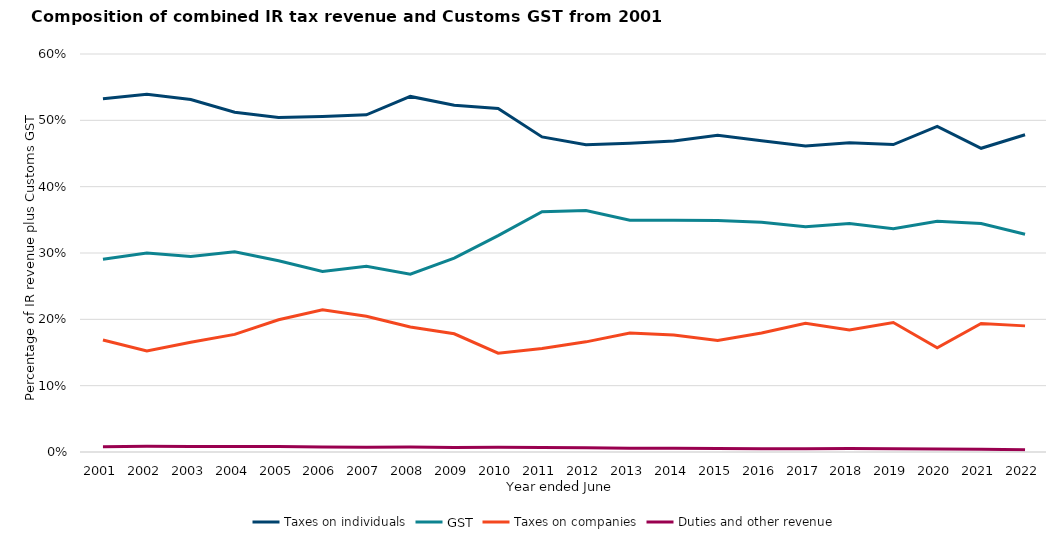
| Category | Taxes on individuals | GST | Taxes on companies | Duties and other revenue |
|---|---|---|---|---|
| 2001.0 | 0.533 | 0.291 | 0.169 | 0.008 |
| 2002.0 | 0.539 | 0.3 | 0.152 | 0.009 |
| 2003.0 | 0.531 | 0.295 | 0.165 | 0.008 |
| 2004.0 | 0.512 | 0.302 | 0.177 | 0.008 |
| 2005.0 | 0.504 | 0.288 | 0.199 | 0.008 |
| 2006.0 | 0.506 | 0.272 | 0.214 | 0.008 |
| 2007.0 | 0.508 | 0.28 | 0.205 | 0.007 |
| 2008.0 | 0.536 | 0.268 | 0.188 | 0.007 |
| 2009.0 | 0.523 | 0.292 | 0.178 | 0.007 |
| 2010.0 | 0.518 | 0.326 | 0.149 | 0.007 |
| 2011.0 | 0.475 | 0.362 | 0.156 | 0.007 |
| 2012.0 | 0.463 | 0.364 | 0.166 | 0.006 |
| 2013.0 | 0.465 | 0.349 | 0.179 | 0.006 |
| 2014.0 | 0.469 | 0.349 | 0.176 | 0.006 |
| 2015.0 | 0.477 | 0.349 | 0.168 | 0.005 |
| 2016.0 | 0.469 | 0.347 | 0.179 | 0.005 |
| 2017.0 | 0.461 | 0.34 | 0.194 | 0.005 |
| 2018.0 | 0.466 | 0.345 | 0.184 | 0.005 |
| 2019.0 | 0.464 | 0.336 | 0.195 | 0.005 |
| 2020.0 | 0.491 | 0.348 | 0.157 | 0.004 |
| 2021.0 | 0.458 | 0.345 | 0.194 | 0.004 |
| 2022.0 | 0.478 | 0.328 | 0.19 | 0.003 |